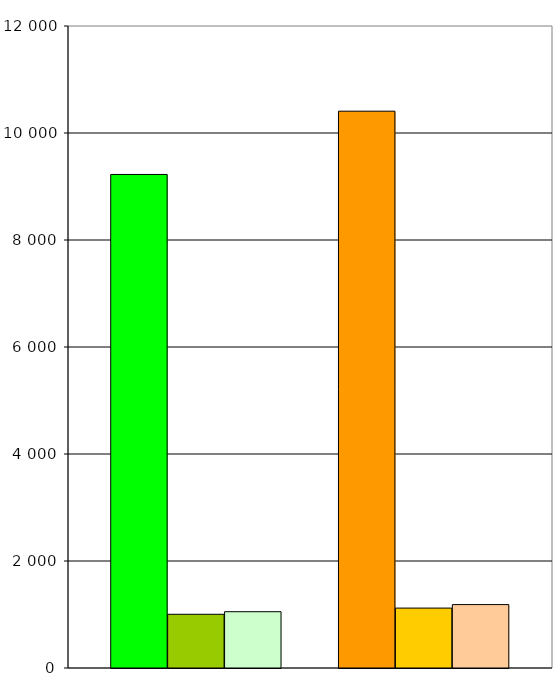
| Category | Series 0 | Series 1 | Series 2 | Series 3 | Series 4 | Series 5 | Series 6 |
|---|---|---|---|---|---|---|---|
| 0 | 9225 | 1004 | 1052 |  | 10408 | 1120 | 1185 |